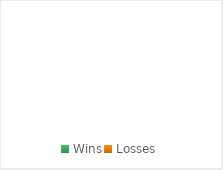
| Category | N° |
|---|---|
| Wins | 0 |
| Losses | 0 |